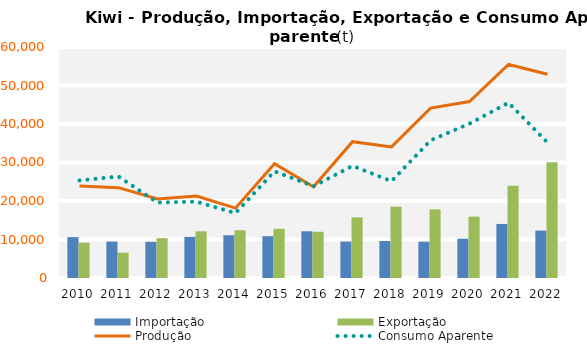
| Category | Importação | Exportação |
|---|---|---|
| 2010.0 | 10613.3 | 9174.807 |
| 2011.0 | 9474.005 | 6580.005 |
| 2012.0 | 9398.262 | 10338.951 |
| 2013.0 | 10666.202 | 12140.939 |
| 2014.0 | 11108.842 | 12412.263 |
| 2015.0 | 10851.198 | 12790.624 |
| 2016.0 | 12134.391 | 11999.97 |
| 2017.0 | 9465.59 | 15750.752 |
| 2018.0 | 9604.859 | 18523.478 |
| 2019.0 | 9427.82 | 17815.212 |
| 2020.0 | 10208.143 | 15931.393 |
| 2021.0 | 14039.05 | 23978.038 |
| 2022.0 | 12316.403 | 30047.622 |